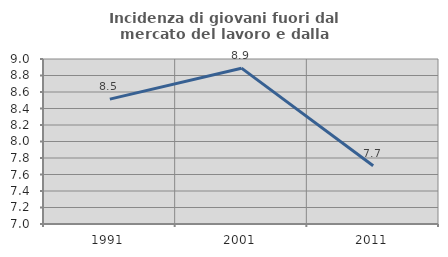
| Category | Incidenza di giovani fuori dal mercato del lavoro e dalla formazione  |
|---|---|
| 1991.0 | 8.513 |
| 2001.0 | 8.889 |
| 2011.0 | 7.707 |